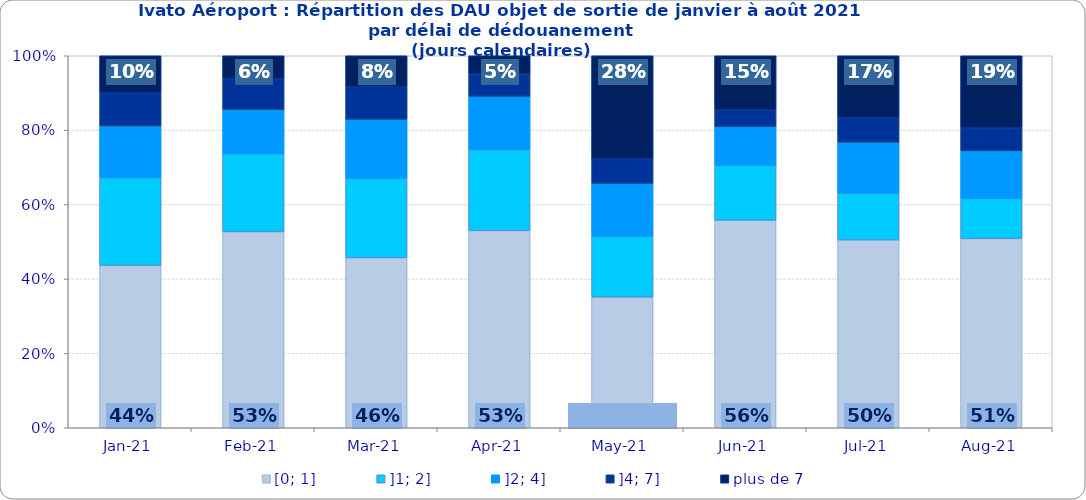
| Category | [0; 1] | ]1; 2] | ]2; 4] | ]4; 7] | plus de 7 |
|---|---|---|---|---|---|
| 2021-01-01 | 0.436 | 0.236 | 0.139 | 0.09 | 0.099 |
| 2021-02-01 | 0.527 | 0.21 | 0.119 | 0.083 | 0.061 |
| 2021-03-01 | 0.457 | 0.214 | 0.159 | 0.088 | 0.082 |
| 2021-04-01 | 0.53 | 0.217 | 0.144 | 0.06 | 0.048 |
| 2021-05-01 | 0.351 | 0.163 | 0.142 | 0.067 | 0.277 |
| 2021-06-01 | 0.558 | 0.148 | 0.104 | 0.045 | 0.145 |
| 2021-07-01 | 0.505 | 0.126 | 0.137 | 0.066 | 0.166 |
| 2021-08-01 | 0.509 | 0.108 | 0.128 | 0.062 | 0.193 |